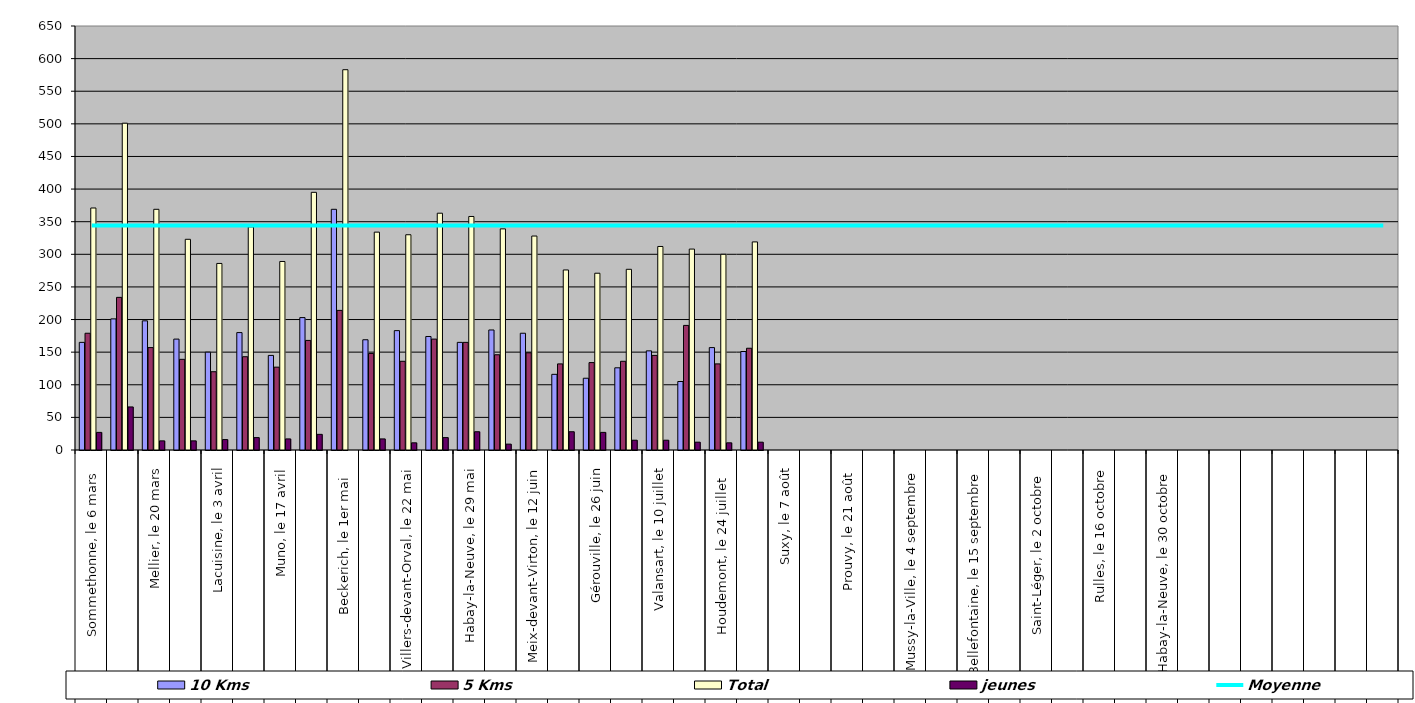
| Category | 10 Kms | 5 Kms | Total | jeunes |
|---|---|---|---|---|
| 0 | 165 | 179 | 371 | 27 |
| 1 | 201 | 234 | 501 | 66 |
| 2 | 198 | 157 | 369 | 14 |
| 3 | 170 | 139 | 323 | 14 |
| 4 | 150 | 120 | 286 | 16 |
| 5 | 180 | 143 | 342 | 19 |
| 6 | 145 | 127 | 289 | 17 |
| 7 | 203 | 168 | 395 | 24 |
| 8 | 369 | 214 | 583 | 0 |
| 9 | 169 | 148 | 334 | 17 |
| 10 | 183 | 136 | 330 | 11 |
| 11 | 174 | 170 | 363 | 19 |
| 12 | 165 | 165 | 358 | 28 |
| 13 | 184 | 146 | 339 | 9 |
| 14 | 179 | 149 | 328 | 0 |
| 15 | 116 | 132 | 276 | 28 |
| 16 | 110 | 134 | 271 | 27 |
| 17 | 126 | 136 | 277 | 15 |
| 18 | 152 | 145 | 312 | 15 |
| 19 | 105 | 191 | 308 | 12 |
| 20 | 157 | 132 | 300 | 11 |
| 21 | 151 | 156 | 319 | 12 |
| 22 | 0 | 0 | 0 | 0 |
| 23 | 0 | 0 | 0 | 0 |
| 24 | 0 | 0 | 0 | 0 |
| 25 | 0 | 0 | 0 | 0 |
| 26 | 0 | 0 | 0 | 0 |
| 27 | 0 | 0 | 0 | 0 |
| 28 | 0 | 0 | 0 | 0 |
| 29 | 0 | 0 | 0 | 0 |
| 30 | 0 | 0 | 0 | 0 |
| 31 | 0 | 0 | 0 | 0 |
| 32 | 0 | 0 | 0 | 0 |
| 33 | 0 | 0 | 0 | 0 |
| 34 | 0 | 0 | 0 | 0 |
| 35 | 0 | 0 | 0 | 0 |
| 36 | 0 | 0 | 0 | 0 |
| 37 | 0 | 0 | 0 | 0 |
| 38 | 0 | 0 | 0 | 0 |
| 39 | 0 | 0 | 0 | 0 |
| 40 | 0 | 0 | 0 | 0 |
| 41 | 0 | 0 | 0 | 0 |